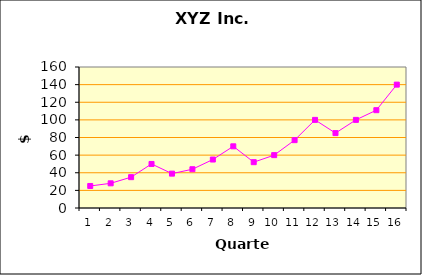
| Category | Sales (Y) |
|---|---|
| 0 | 25 |
| 1 | 28 |
| 2 | 35 |
| 3 | 50 |
| 4 | 39 |
| 5 | 44 |
| 6 | 55 |
| 7 | 70 |
| 8 | 52 |
| 9 | 60 |
| 10 | 77 |
| 11 | 100 |
| 12 | 85 |
| 13 | 100 |
| 14 | 111 |
| 15 | 140 |